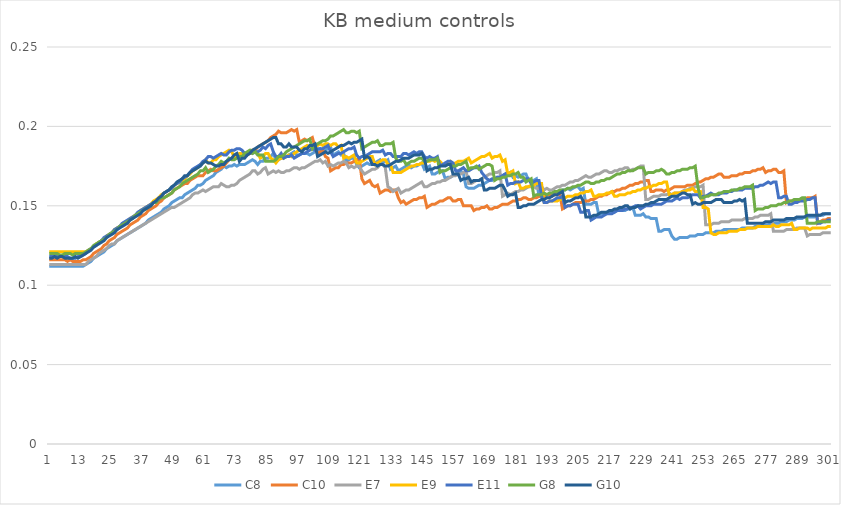
| Category | C8 | C10 | E7 | E9 | E11 | G8 | G10 |
|---|---|---|---|---|---|---|---|
| 0 | 0.112 | 0.116 | 0.113 | 0.121 | 0.118 | 0.12 | 0.117 |
| 1 | 0.112 | 0.116 | 0.113 | 0.121 | 0.118 | 0.12 | 0.117 |
| 2 | 0.112 | 0.116 | 0.113 | 0.121 | 0.118 | 0.12 | 0.118 |
| 3 | 0.112 | 0.116 | 0.113 | 0.121 | 0.118 | 0.12 | 0.117 |
| 4 | 0.112 | 0.116 | 0.113 | 0.121 | 0.118 | 0.119 | 0.118 |
| 5 | 0.112 | 0.116 | 0.113 | 0.121 | 0.118 | 0.119 | 0.118 |
| 6 | 0.112 | 0.116 | 0.113 | 0.121 | 0.118 | 0.12 | 0.117 |
| 7 | 0.112 | 0.115 | 0.113 | 0.121 | 0.118 | 0.12 | 0.117 |
| 8 | 0.112 | 0.116 | 0.113 | 0.121 | 0.117 | 0.12 | 0.117 |
| 9 | 0.112 | 0.115 | 0.113 | 0.121 | 0.117 | 0.119 | 0.117 |
| 10 | 0.112 | 0.115 | 0.113 | 0.121 | 0.117 | 0.12 | 0.118 |
| 11 | 0.112 | 0.115 | 0.113 | 0.121 | 0.118 | 0.12 | 0.117 |
| 12 | 0.112 | 0.115 | 0.113 | 0.121 | 0.118 | 0.12 | 0.118 |
| 13 | 0.112 | 0.116 | 0.113 | 0.121 | 0.119 | 0.12 | 0.119 |
| 14 | 0.113 | 0.116 | 0.113 | 0.121 | 0.12 | 0.121 | 0.12 |
| 15 | 0.114 | 0.117 | 0.115 | 0.122 | 0.122 | 0.122 | 0.121 |
| 16 | 0.115 | 0.118 | 0.116 | 0.123 | 0.123 | 0.123 | 0.122 |
| 17 | 0.117 | 0.12 | 0.117 | 0.124 | 0.124 | 0.125 | 0.124 |
| 18 | 0.118 | 0.121 | 0.118 | 0.126 | 0.125 | 0.126 | 0.125 |
| 19 | 0.119 | 0.122 | 0.12 | 0.127 | 0.127 | 0.127 | 0.126 |
| 20 | 0.12 | 0.123 | 0.121 | 0.128 | 0.128 | 0.128 | 0.127 |
| 21 | 0.121 | 0.125 | 0.122 | 0.129 | 0.13 | 0.129 | 0.128 |
| 22 | 0.123 | 0.126 | 0.123 | 0.131 | 0.131 | 0.13 | 0.13 |
| 23 | 0.124 | 0.128 | 0.125 | 0.132 | 0.132 | 0.132 | 0.131 |
| 24 | 0.125 | 0.129 | 0.126 | 0.133 | 0.133 | 0.133 | 0.132 |
| 25 | 0.126 | 0.13 | 0.126 | 0.135 | 0.135 | 0.134 | 0.133 |
| 26 | 0.128 | 0.132 | 0.128 | 0.136 | 0.136 | 0.135 | 0.135 |
| 27 | 0.129 | 0.133 | 0.129 | 0.137 | 0.137 | 0.137 | 0.136 |
| 28 | 0.13 | 0.134 | 0.13 | 0.138 | 0.139 | 0.138 | 0.137 |
| 29 | 0.131 | 0.135 | 0.131 | 0.139 | 0.14 | 0.139 | 0.138 |
| 30 | 0.132 | 0.136 | 0.132 | 0.14 | 0.141 | 0.14 | 0.139 |
| 31 | 0.133 | 0.138 | 0.133 | 0.142 | 0.142 | 0.141 | 0.141 |
| 32 | 0.134 | 0.139 | 0.134 | 0.143 | 0.143 | 0.142 | 0.142 |
| 33 | 0.135 | 0.14 | 0.135 | 0.144 | 0.144 | 0.144 | 0.143 |
| 34 | 0.136 | 0.141 | 0.136 | 0.145 | 0.146 | 0.145 | 0.144 |
| 35 | 0.137 | 0.143 | 0.137 | 0.147 | 0.147 | 0.146 | 0.145 |
| 36 | 0.138 | 0.144 | 0.138 | 0.148 | 0.148 | 0.147 | 0.147 |
| 37 | 0.139 | 0.145 | 0.139 | 0.149 | 0.149 | 0.148 | 0.148 |
| 38 | 0.141 | 0.147 | 0.14 | 0.15 | 0.15 | 0.149 | 0.149 |
| 39 | 0.142 | 0.148 | 0.141 | 0.151 | 0.151 | 0.15 | 0.15 |
| 40 | 0.143 | 0.149 | 0.142 | 0.153 | 0.152 | 0.152 | 0.152 |
| 41 | 0.144 | 0.15 | 0.143 | 0.154 | 0.153 | 0.152 | 0.153 |
| 42 | 0.145 | 0.152 | 0.144 | 0.155 | 0.154 | 0.154 | 0.155 |
| 43 | 0.146 | 0.153 | 0.145 | 0.157 | 0.156 | 0.155 | 0.156 |
| 44 | 0.148 | 0.155 | 0.146 | 0.158 | 0.158 | 0.155 | 0.158 |
| 45 | 0.149 | 0.156 | 0.147 | 0.159 | 0.159 | 0.156 | 0.159 |
| 46 | 0.15 | 0.157 | 0.148 | 0.16 | 0.16 | 0.157 | 0.16 |
| 47 | 0.152 | 0.158 | 0.149 | 0.161 | 0.161 | 0.158 | 0.162 |
| 48 | 0.153 | 0.16 | 0.149 | 0.163 | 0.163 | 0.16 | 0.163 |
| 49 | 0.154 | 0.161 | 0.15 | 0.164 | 0.164 | 0.161 | 0.165 |
| 50 | 0.155 | 0.162 | 0.151 | 0.165 | 0.165 | 0.162 | 0.166 |
| 51 | 0.155 | 0.163 | 0.152 | 0.166 | 0.167 | 0.164 | 0.167 |
| 52 | 0.157 | 0.164 | 0.153 | 0.167 | 0.168 | 0.165 | 0.169 |
| 53 | 0.158 | 0.164 | 0.154 | 0.169 | 0.169 | 0.166 | 0.169 |
| 54 | 0.159 | 0.166 | 0.155 | 0.17 | 0.171 | 0.167 | 0.171 |
| 55 | 0.16 | 0.167 | 0.157 | 0.172 | 0.173 | 0.168 | 0.172 |
| 56 | 0.161 | 0.168 | 0.158 | 0.173 | 0.174 | 0.169 | 0.173 |
| 57 | 0.163 | 0.169 | 0.158 | 0.174 | 0.175 | 0.17 | 0.174 |
| 58 | 0.163 | 0.169 | 0.159 | 0.176 | 0.176 | 0.172 | 0.175 |
| 59 | 0.164 | 0.169 | 0.16 | 0.177 | 0.178 | 0.172 | 0.177 |
| 60 | 0.166 | 0.171 | 0.159 | 0.179 | 0.179 | 0.174 | 0.178 |
| 61 | 0.167 | 0.172 | 0.16 | 0.177 | 0.181 | 0.171 | 0.177 |
| 62 | 0.168 | 0.173 | 0.161 | 0.177 | 0.181 | 0.172 | 0.177 |
| 63 | 0.169 | 0.172 | 0.162 | 0.179 | 0.18 | 0.173 | 0.176 |
| 64 | 0.171 | 0.172 | 0.162 | 0.179 | 0.181 | 0.175 | 0.175 |
| 65 | 0.172 | 0.173 | 0.162 | 0.181 | 0.182 | 0.176 | 0.175 |
| 66 | 0.173 | 0.174 | 0.164 | 0.182 | 0.183 | 0.178 | 0.176 |
| 67 | 0.175 | 0.175 | 0.163 | 0.183 | 0.182 | 0.177 | 0.176 |
| 68 | 0.174 | 0.177 | 0.162 | 0.184 | 0.182 | 0.178 | 0.178 |
| 69 | 0.175 | 0.179 | 0.162 | 0.185 | 0.184 | 0.18 | 0.179 |
| 70 | 0.175 | 0.18 | 0.163 | 0.184 | 0.185 | 0.179 | 0.18 |
| 71 | 0.176 | 0.18 | 0.163 | 0.181 | 0.185 | 0.179 | 0.182 |
| 72 | 0.175 | 0.181 | 0.164 | 0.182 | 0.186 | 0.18 | 0.183 |
| 73 | 0.176 | 0.181 | 0.166 | 0.183 | 0.186 | 0.181 | 0.178 |
| 74 | 0.176 | 0.181 | 0.167 | 0.183 | 0.185 | 0.181 | 0.18 |
| 75 | 0.176 | 0.182 | 0.168 | 0.183 | 0.183 | 0.183 | 0.18 |
| 76 | 0.177 | 0.183 | 0.169 | 0.182 | 0.182 | 0.184 | 0.182 |
| 77 | 0.178 | 0.183 | 0.17 | 0.183 | 0.184 | 0.185 | 0.183 |
| 78 | 0.179 | 0.184 | 0.172 | 0.185 | 0.183 | 0.183 | 0.185 |
| 79 | 0.178 | 0.185 | 0.172 | 0.184 | 0.184 | 0.184 | 0.186 |
| 80 | 0.176 | 0.187 | 0.17 | 0.183 | 0.184 | 0.182 | 0.187 |
| 81 | 0.178 | 0.188 | 0.171 | 0.18 | 0.185 | 0.182 | 0.188 |
| 82 | 0.178 | 0.189 | 0.173 | 0.181 | 0.187 | 0.182 | 0.189 |
| 83 | 0.18 | 0.19 | 0.174 | 0.183 | 0.186 | 0.178 | 0.19 |
| 84 | 0.18 | 0.191 | 0.17 | 0.183 | 0.188 | 0.178 | 0.191 |
| 85 | 0.181 | 0.193 | 0.171 | 0.18 | 0.189 | 0.178 | 0.192 |
| 86 | 0.183 | 0.194 | 0.172 | 0.179 | 0.184 | 0.178 | 0.193 |
| 87 | 0.179 | 0.195 | 0.171 | 0.177 | 0.181 | 0.179 | 0.193 |
| 88 | 0.179 | 0.197 | 0.172 | 0.179 | 0.181 | 0.181 | 0.189 |
| 89 | 0.18 | 0.196 | 0.171 | 0.18 | 0.183 | 0.181 | 0.189 |
| 90 | 0.182 | 0.196 | 0.171 | 0.18 | 0.18 | 0.182 | 0.187 |
| 91 | 0.181 | 0.196 | 0.172 | 0.181 | 0.181 | 0.184 | 0.187 |
| 92 | 0.182 | 0.197 | 0.172 | 0.182 | 0.181 | 0.185 | 0.189 |
| 93 | 0.183 | 0.198 | 0.173 | 0.181 | 0.182 | 0.186 | 0.187 |
| 94 | 0.184 | 0.197 | 0.174 | 0.183 | 0.18 | 0.187 | 0.187 |
| 95 | 0.182 | 0.198 | 0.174 | 0.184 | 0.181 | 0.188 | 0.187 |
| 96 | 0.182 | 0.19 | 0.173 | 0.185 | 0.182 | 0.189 | 0.185 |
| 97 | 0.183 | 0.191 | 0.174 | 0.186 | 0.183 | 0.19 | 0.184 |
| 98 | 0.183 | 0.192 | 0.174 | 0.187 | 0.183 | 0.191 | 0.186 |
| 99 | 0.183 | 0.191 | 0.175 | 0.188 | 0.184 | 0.191 | 0.186 |
| 100 | 0.182 | 0.192 | 0.176 | 0.187 | 0.185 | 0.192 | 0.188 |
| 101 | 0.183 | 0.193 | 0.177 | 0.187 | 0.186 | 0.186 | 0.188 |
| 102 | 0.184 | 0.187 | 0.178 | 0.188 | 0.185 | 0.188 | 0.189 |
| 103 | 0.185 | 0.183 | 0.178 | 0.188 | 0.186 | 0.189 | 0.181 |
| 104 | 0.186 | 0.184 | 0.179 | 0.189 | 0.186 | 0.19 | 0.182 |
| 105 | 0.184 | 0.185 | 0.177 | 0.188 | 0.186 | 0.191 | 0.183 |
| 106 | 0.185 | 0.181 | 0.178 | 0.189 | 0.187 | 0.191 | 0.184 |
| 107 | 0.186 | 0.18 | 0.175 | 0.189 | 0.188 | 0.192 | 0.183 |
| 108 | 0.187 | 0.172 | 0.176 | 0.188 | 0.184 | 0.194 | 0.184 |
| 109 | 0.182 | 0.173 | 0.175 | 0.189 | 0.181 | 0.194 | 0.185 |
| 110 | 0.183 | 0.174 | 0.176 | 0.189 | 0.182 | 0.195 | 0.186 |
| 111 | 0.184 | 0.174 | 0.177 | 0.187 | 0.183 | 0.196 | 0.187 |
| 112 | 0.182 | 0.176 | 0.177 | 0.188 | 0.183 | 0.197 | 0.188 |
| 113 | 0.183 | 0.176 | 0.178 | 0.18 | 0.184 | 0.198 | 0.188 |
| 114 | 0.178 | 0.177 | 0.177 | 0.181 | 0.185 | 0.196 | 0.189 |
| 115 | 0.179 | 0.177 | 0.174 | 0.18 | 0.186 | 0.196 | 0.19 |
| 116 | 0.18 | 0.177 | 0.175 | 0.181 | 0.186 | 0.197 | 0.189 |
| 117 | 0.18 | 0.178 | 0.174 | 0.182 | 0.187 | 0.197 | 0.19 |
| 118 | 0.176 | 0.179 | 0.175 | 0.177 | 0.182 | 0.196 | 0.19 |
| 119 | 0.174 | 0.18 | 0.175 | 0.177 | 0.18 | 0.197 | 0.191 |
| 120 | 0.175 | 0.167 | 0.172 | 0.178 | 0.181 | 0.186 | 0.192 |
| 121 | 0.176 | 0.164 | 0.17 | 0.179 | 0.181 | 0.187 | 0.18 |
| 122 | 0.177 | 0.165 | 0.171 | 0.18 | 0.182 | 0.188 | 0.181 |
| 123 | 0.176 | 0.166 | 0.172 | 0.181 | 0.183 | 0.189 | 0.18 |
| 124 | 0.176 | 0.163 | 0.173 | 0.181 | 0.184 | 0.19 | 0.176 |
| 125 | 0.177 | 0.162 | 0.173 | 0.176 | 0.184 | 0.19 | 0.176 |
| 126 | 0.178 | 0.163 | 0.174 | 0.177 | 0.184 | 0.191 | 0.175 |
| 127 | 0.179 | 0.158 | 0.176 | 0.178 | 0.184 | 0.188 | 0.176 |
| 128 | 0.177 | 0.159 | 0.176 | 0.179 | 0.185 | 0.188 | 0.176 |
| 129 | 0.178 | 0.16 | 0.174 | 0.179 | 0.182 | 0.189 | 0.175 |
| 130 | 0.179 | 0.16 | 0.162 | 0.176 | 0.183 | 0.189 | 0.175 |
| 131 | 0.173 | 0.159 | 0.161 | 0.176 | 0.183 | 0.189 | 0.176 |
| 132 | 0.174 | 0.16 | 0.159 | 0.171 | 0.181 | 0.19 | 0.177 |
| 133 | 0.175 | 0.16 | 0.16 | 0.171 | 0.181 | 0.18 | 0.178 |
| 134 | 0.172 | 0.155 | 0.161 | 0.171 | 0.181 | 0.178 | 0.178 |
| 135 | 0.173 | 0.152 | 0.158 | 0.171 | 0.181 | 0.178 | 0.179 |
| 136 | 0.174 | 0.153 | 0.159 | 0.172 | 0.183 | 0.179 | 0.18 |
| 137 | 0.175 | 0.151 | 0.16 | 0.173 | 0.183 | 0.176 | 0.18 |
| 138 | 0.176 | 0.152 | 0.16 | 0.174 | 0.182 | 0.177 | 0.18 |
| 139 | 0.174 | 0.153 | 0.161 | 0.175 | 0.183 | 0.178 | 0.181 |
| 140 | 0.175 | 0.154 | 0.162 | 0.175 | 0.184 | 0.178 | 0.182 |
| 141 | 0.175 | 0.154 | 0.163 | 0.176 | 0.183 | 0.179 | 0.182 |
| 142 | 0.176 | 0.155 | 0.164 | 0.176 | 0.184 | 0.18 | 0.182 |
| 143 | 0.177 | 0.155 | 0.165 | 0.177 | 0.184 | 0.18 | 0.183 |
| 144 | 0.173 | 0.156 | 0.162 | 0.177 | 0.181 | 0.178 | 0.18 |
| 145 | 0.174 | 0.149 | 0.162 | 0.178 | 0.18 | 0.178 | 0.172 |
| 146 | 0.175 | 0.15 | 0.163 | 0.178 | 0.181 | 0.179 | 0.173 |
| 147 | 0.17 | 0.151 | 0.164 | 0.179 | 0.18 | 0.179 | 0.173 |
| 148 | 0.17 | 0.151 | 0.164 | 0.178 | 0.18 | 0.179 | 0.174 |
| 149 | 0.171 | 0.152 | 0.165 | 0.179 | 0.181 | 0.18 | 0.174 |
| 150 | 0.172 | 0.153 | 0.165 | 0.178 | 0.175 | 0.171 | 0.175 |
| 151 | 0.172 | 0.153 | 0.166 | 0.176 | 0.176 | 0.172 | 0.175 |
| 152 | 0.167 | 0.154 | 0.166 | 0.176 | 0.177 | 0.172 | 0.175 |
| 153 | 0.168 | 0.155 | 0.167 | 0.177 | 0.178 | 0.173 | 0.176 |
| 154 | 0.168 | 0.155 | 0.168 | 0.178 | 0.178 | 0.174 | 0.176 |
| 155 | 0.169 | 0.153 | 0.169 | 0.176 | 0.177 | 0.175 | 0.17 |
| 156 | 0.17 | 0.153 | 0.169 | 0.177 | 0.172 | 0.175 | 0.17 |
| 157 | 0.171 | 0.154 | 0.17 | 0.178 | 0.172 | 0.176 | 0.17 |
| 158 | 0.172 | 0.154 | 0.17 | 0.178 | 0.173 | 0.176 | 0.166 |
| 159 | 0.17 | 0.15 | 0.171 | 0.178 | 0.174 | 0.177 | 0.167 |
| 160 | 0.162 | 0.15 | 0.172 | 0.179 | 0.172 | 0.178 | 0.167 |
| 161 | 0.161 | 0.15 | 0.164 | 0.18 | 0.172 | 0.173 | 0.168 |
| 162 | 0.161 | 0.15 | 0.164 | 0.177 | 0.173 | 0.174 | 0.165 |
| 163 | 0.161 | 0.147 | 0.165 | 0.178 | 0.174 | 0.174 | 0.166 |
| 164 | 0.162 | 0.148 | 0.166 | 0.179 | 0.174 | 0.175 | 0.166 |
| 165 | 0.163 | 0.148 | 0.166 | 0.18 | 0.175 | 0.173 | 0.166 |
| 166 | 0.163 | 0.149 | 0.167 | 0.181 | 0.171 | 0.174 | 0.167 |
| 167 | 0.164 | 0.149 | 0.168 | 0.181 | 0.169 | 0.175 | 0.16 |
| 168 | 0.165 | 0.15 | 0.169 | 0.182 | 0.167 | 0.176 | 0.16 |
| 169 | 0.166 | 0.148 | 0.17 | 0.183 | 0.166 | 0.176 | 0.161 |
| 170 | 0.166 | 0.148 | 0.17 | 0.18 | 0.167 | 0.175 | 0.161 |
| 171 | 0.167 | 0.149 | 0.171 | 0.181 | 0.167 | 0.166 | 0.161 |
| 172 | 0.168 | 0.149 | 0.171 | 0.181 | 0.168 | 0.167 | 0.162 |
| 173 | 0.168 | 0.15 | 0.172 | 0.182 | 0.168 | 0.167 | 0.163 |
| 174 | 0.169 | 0.151 | 0.156 | 0.178 | 0.169 | 0.168 | 0.163 |
| 175 | 0.17 | 0.151 | 0.157 | 0.179 | 0.17 | 0.168 | 0.16 |
| 176 | 0.17 | 0.151 | 0.158 | 0.17 | 0.163 | 0.169 | 0.156 |
| 177 | 0.171 | 0.152 | 0.157 | 0.171 | 0.164 | 0.169 | 0.157 |
| 178 | 0.168 | 0.153 | 0.158 | 0.172 | 0.164 | 0.17 | 0.157 |
| 179 | 0.169 | 0.153 | 0.159 | 0.164 | 0.165 | 0.17 | 0.158 |
| 180 | 0.168 | 0.154 | 0.159 | 0.165 | 0.165 | 0.171 | 0.149 |
| 181 | 0.169 | 0.154 | 0.16 | 0.161 | 0.165 | 0.168 | 0.149 |
| 182 | 0.17 | 0.155 | 0.16 | 0.161 | 0.166 | 0.168 | 0.15 |
| 183 | 0.17 | 0.155 | 0.161 | 0.162 | 0.167 | 0.165 | 0.15 |
| 184 | 0.166 | 0.154 | 0.162 | 0.162 | 0.167 | 0.166 | 0.151 |
| 185 | 0.166 | 0.154 | 0.162 | 0.163 | 0.164 | 0.167 | 0.151 |
| 186 | 0.166 | 0.155 | 0.162 | 0.163 | 0.165 | 0.156 | 0.151 |
| 187 | 0.167 | 0.155 | 0.161 | 0.164 | 0.166 | 0.157 | 0.152 |
| 188 | 0.156 | 0.156 | 0.161 | 0.164 | 0.166 | 0.157 | 0.153 |
| 189 | 0.156 | 0.156 | 0.162 | 0.164 | 0.156 | 0.157 | 0.154 |
| 190 | 0.157 | 0.156 | 0.16 | 0.152 | 0.152 | 0.158 | 0.154 |
| 191 | 0.157 | 0.157 | 0.161 | 0.152 | 0.152 | 0.157 | 0.155 |
| 192 | 0.157 | 0.157 | 0.16 | 0.153 | 0.153 | 0.158 | 0.155 |
| 193 | 0.157 | 0.156 | 0.16 | 0.153 | 0.153 | 0.158 | 0.156 |
| 194 | 0.158 | 0.157 | 0.161 | 0.153 | 0.154 | 0.159 | 0.157 |
| 195 | 0.159 | 0.157 | 0.162 | 0.153 | 0.155 | 0.159 | 0.157 |
| 196 | 0.159 | 0.158 | 0.162 | 0.154 | 0.155 | 0.16 | 0.158 |
| 197 | 0.16 | 0.148 | 0.163 | 0.154 | 0.156 | 0.16 | 0.159 |
| 198 | 0.16 | 0.149 | 0.163 | 0.155 | 0.149 | 0.16 | 0.152 |
| 199 | 0.161 | 0.15 | 0.164 | 0.156 | 0.15 | 0.161 | 0.153 |
| 200 | 0.16 | 0.15 | 0.165 | 0.156 | 0.15 | 0.161 | 0.153 |
| 201 | 0.161 | 0.151 | 0.165 | 0.156 | 0.151 | 0.162 | 0.154 |
| 202 | 0.162 | 0.152 | 0.166 | 0.157 | 0.151 | 0.162 | 0.155 |
| 203 | 0.162 | 0.152 | 0.166 | 0.157 | 0.151 | 0.163 | 0.155 |
| 204 | 0.16 | 0.152 | 0.167 | 0.158 | 0.146 | 0.163 | 0.156 |
| 205 | 0.161 | 0.153 | 0.168 | 0.158 | 0.146 | 0.164 | 0.153 |
| 206 | 0.151 | 0.153 | 0.169 | 0.159 | 0.147 | 0.165 | 0.143 |
| 207 | 0.151 | 0.153 | 0.168 | 0.159 | 0.147 | 0.165 | 0.143 |
| 208 | 0.151 | 0.154 | 0.168 | 0.16 | 0.141 | 0.164 | 0.143 |
| 209 | 0.152 | 0.154 | 0.169 | 0.156 | 0.142 | 0.164 | 0.144 |
| 210 | 0.152 | 0.155 | 0.17 | 0.156 | 0.143 | 0.165 | 0.144 |
| 211 | 0.144 | 0.156 | 0.17 | 0.157 | 0.143 | 0.165 | 0.145 |
| 212 | 0.145 | 0.156 | 0.171 | 0.157 | 0.143 | 0.166 | 0.146 |
| 213 | 0.145 | 0.157 | 0.172 | 0.157 | 0.144 | 0.166 | 0.146 |
| 214 | 0.145 | 0.157 | 0.172 | 0.158 | 0.145 | 0.167 | 0.146 |
| 215 | 0.146 | 0.158 | 0.171 | 0.158 | 0.145 | 0.167 | 0.147 |
| 216 | 0.146 | 0.159 | 0.171 | 0.159 | 0.145 | 0.168 | 0.147 |
| 217 | 0.146 | 0.159 | 0.172 | 0.156 | 0.146 | 0.169 | 0.148 |
| 218 | 0.147 | 0.16 | 0.172 | 0.156 | 0.147 | 0.17 | 0.148 |
| 219 | 0.147 | 0.16 | 0.173 | 0.157 | 0.147 | 0.17 | 0.149 |
| 220 | 0.147 | 0.161 | 0.173 | 0.157 | 0.147 | 0.171 | 0.149 |
| 221 | 0.147 | 0.161 | 0.174 | 0.157 | 0.148 | 0.171 | 0.15 |
| 222 | 0.148 | 0.162 | 0.174 | 0.158 | 0.148 | 0.172 | 0.15 |
| 223 | 0.148 | 0.163 | 0.172 | 0.158 | 0.149 | 0.172 | 0.148 |
| 224 | 0.149 | 0.163 | 0.173 | 0.159 | 0.149 | 0.172 | 0.149 |
| 225 | 0.144 | 0.164 | 0.173 | 0.159 | 0.15 | 0.173 | 0.149 |
| 226 | 0.144 | 0.164 | 0.174 | 0.16 | 0.15 | 0.174 | 0.15 |
| 227 | 0.144 | 0.165 | 0.175 | 0.16 | 0.148 | 0.174 | 0.15 |
| 228 | 0.145 | 0.165 | 0.175 | 0.161 | 0.149 | 0.174 | 0.15 |
| 229 | 0.143 | 0.166 | 0.154 | 0.161 | 0.15 | 0.17 | 0.151 |
| 230 | 0.143 | 0.166 | 0.154 | 0.162 | 0.15 | 0.171 | 0.151 |
| 231 | 0.142 | 0.159 | 0.155 | 0.162 | 0.15 | 0.171 | 0.152 |
| 232 | 0.142 | 0.159 | 0.156 | 0.163 | 0.151 | 0.171 | 0.152 |
| 233 | 0.142 | 0.16 | 0.156 | 0.163 | 0.151 | 0.172 | 0.153 |
| 234 | 0.134 | 0.16 | 0.156 | 0.164 | 0.151 | 0.172 | 0.154 |
| 235 | 0.134 | 0.16 | 0.157 | 0.164 | 0.151 | 0.173 | 0.154 |
| 236 | 0.135 | 0.159 | 0.157 | 0.165 | 0.152 | 0.172 | 0.154 |
| 237 | 0.135 | 0.16 | 0.157 | 0.165 | 0.153 | 0.17 | 0.154 |
| 238 | 0.135 | 0.16 | 0.158 | 0.157 | 0.153 | 0.17 | 0.155 |
| 239 | 0.131 | 0.161 | 0.157 | 0.157 | 0.153 | 0.171 | 0.156 |
| 240 | 0.129 | 0.162 | 0.158 | 0.158 | 0.154 | 0.171 | 0.156 |
| 241 | 0.129 | 0.162 | 0.158 | 0.158 | 0.155 | 0.172 | 0.156 |
| 242 | 0.13 | 0.162 | 0.158 | 0.158 | 0.154 | 0.172 | 0.157 |
| 243 | 0.13 | 0.162 | 0.159 | 0.159 | 0.155 | 0.173 | 0.158 |
| 244 | 0.13 | 0.162 | 0.16 | 0.159 | 0.155 | 0.173 | 0.158 |
| 245 | 0.13 | 0.163 | 0.16 | 0.16 | 0.155 | 0.173 | 0.157 |
| 246 | 0.131 | 0.163 | 0.161 | 0.16 | 0.156 | 0.174 | 0.157 |
| 247 | 0.131 | 0.163 | 0.161 | 0.161 | 0.157 | 0.174 | 0.151 |
| 248 | 0.131 | 0.164 | 0.162 | 0.159 | 0.157 | 0.175 | 0.152 |
| 249 | 0.132 | 0.165 | 0.162 | 0.159 | 0.157 | 0.162 | 0.151 |
| 250 | 0.132 | 0.165 | 0.162 | 0.159 | 0.155 | 0.155 | 0.151 |
| 251 | 0.132 | 0.166 | 0.163 | 0.149 | 0.156 | 0.155 | 0.152 |
| 252 | 0.133 | 0.167 | 0.138 | 0.149 | 0.156 | 0.156 | 0.152 |
| 253 | 0.133 | 0.167 | 0.138 | 0.148 | 0.157 | 0.156 | 0.152 |
| 254 | 0.133 | 0.168 | 0.138 | 0.133 | 0.158 | 0.157 | 0.152 |
| 255 | 0.133 | 0.168 | 0.139 | 0.132 | 0.157 | 0.157 | 0.153 |
| 256 | 0.134 | 0.169 | 0.139 | 0.132 | 0.157 | 0.157 | 0.154 |
| 257 | 0.134 | 0.17 | 0.139 | 0.133 | 0.157 | 0.158 | 0.154 |
| 258 | 0.134 | 0.17 | 0.14 | 0.133 | 0.158 | 0.158 | 0.154 |
| 259 | 0.135 | 0.168 | 0.14 | 0.133 | 0.158 | 0.159 | 0.152 |
| 260 | 0.135 | 0.168 | 0.14 | 0.133 | 0.158 | 0.159 | 0.152 |
| 261 | 0.135 | 0.168 | 0.14 | 0.134 | 0.159 | 0.159 | 0.152 |
| 262 | 0.135 | 0.169 | 0.141 | 0.134 | 0.159 | 0.16 | 0.152 |
| 263 | 0.135 | 0.169 | 0.141 | 0.134 | 0.16 | 0.16 | 0.153 |
| 264 | 0.135 | 0.169 | 0.141 | 0.134 | 0.16 | 0.16 | 0.153 |
| 265 | 0.135 | 0.17 | 0.141 | 0.135 | 0.16 | 0.161 | 0.154 |
| 266 | 0.136 | 0.17 | 0.141 | 0.135 | 0.16 | 0.161 | 0.153 |
| 267 | 0.136 | 0.171 | 0.142 | 0.135 | 0.161 | 0.162 | 0.154 |
| 268 | 0.136 | 0.171 | 0.142 | 0.136 | 0.161 | 0.162 | 0.139 |
| 269 | 0.136 | 0.171 | 0.142 | 0.136 | 0.161 | 0.162 | 0.139 |
| 270 | 0.136 | 0.172 | 0.142 | 0.136 | 0.161 | 0.163 | 0.139 |
| 271 | 0.137 | 0.172 | 0.143 | 0.136 | 0.162 | 0.147 | 0.139 |
| 272 | 0.137 | 0.173 | 0.143 | 0.137 | 0.162 | 0.148 | 0.139 |
| 273 | 0.137 | 0.173 | 0.144 | 0.137 | 0.163 | 0.148 | 0.139 |
| 274 | 0.138 | 0.174 | 0.144 | 0.137 | 0.163 | 0.148 | 0.139 |
| 275 | 0.138 | 0.171 | 0.144 | 0.137 | 0.164 | 0.149 | 0.14 |
| 276 | 0.138 | 0.172 | 0.144 | 0.137 | 0.165 | 0.149 | 0.14 |
| 277 | 0.139 | 0.172 | 0.145 | 0.137 | 0.164 | 0.15 | 0.14 |
| 278 | 0.139 | 0.173 | 0.134 | 0.138 | 0.165 | 0.15 | 0.141 |
| 279 | 0.139 | 0.173 | 0.134 | 0.137 | 0.165 | 0.15 | 0.141 |
| 280 | 0.139 | 0.171 | 0.134 | 0.137 | 0.155 | 0.151 | 0.141 |
| 281 | 0.14 | 0.171 | 0.134 | 0.138 | 0.155 | 0.151 | 0.141 |
| 282 | 0.14 | 0.172 | 0.134 | 0.138 | 0.156 | 0.152 | 0.141 |
| 283 | 0.14 | 0.152 | 0.135 | 0.138 | 0.156 | 0.152 | 0.142 |
| 284 | 0.141 | 0.153 | 0.135 | 0.138 | 0.151 | 0.153 | 0.142 |
| 285 | 0.141 | 0.153 | 0.135 | 0.139 | 0.151 | 0.153 | 0.142 |
| 286 | 0.141 | 0.153 | 0.135 | 0.135 | 0.152 | 0.154 | 0.142 |
| 287 | 0.142 | 0.153 | 0.136 | 0.135 | 0.152 | 0.154 | 0.143 |
| 288 | 0.142 | 0.153 | 0.136 | 0.136 | 0.153 | 0.154 | 0.143 |
| 289 | 0.142 | 0.154 | 0.136 | 0.136 | 0.153 | 0.155 | 0.143 |
| 290 | 0.143 | 0.154 | 0.136 | 0.136 | 0.153 | 0.155 | 0.143 |
| 291 | 0.143 | 0.155 | 0.131 | 0.136 | 0.154 | 0.139 | 0.144 |
| 292 | 0.143 | 0.155 | 0.132 | 0.135 | 0.154 | 0.139 | 0.144 |
| 293 | 0.143 | 0.155 | 0.132 | 0.136 | 0.155 | 0.139 | 0.144 |
| 294 | 0.143 | 0.156 | 0.132 | 0.136 | 0.155 | 0.139 | 0.144 |
| 295 | 0.144 | 0.139 | 0.132 | 0.136 | 0.139 | 0.14 | 0.144 |
| 296 | 0.144 | 0.14 | 0.132 | 0.136 | 0.139 | 0.14 | 0.144 |
| 297 | 0.144 | 0.141 | 0.133 | 0.136 | 0.14 | 0.14 | 0.145 |
| 298 | 0.145 | 0.141 | 0.133 | 0.136 | 0.14 | 0.14 | 0.145 |
| 299 | 0.145 | 0.142 | 0.133 | 0.137 | 0.141 | 0.14 | 0.145 |
| 300 | 0.145 | 0.142 | 0.133 | 0.137 | 0.141 | 0.14 | 0.145 |